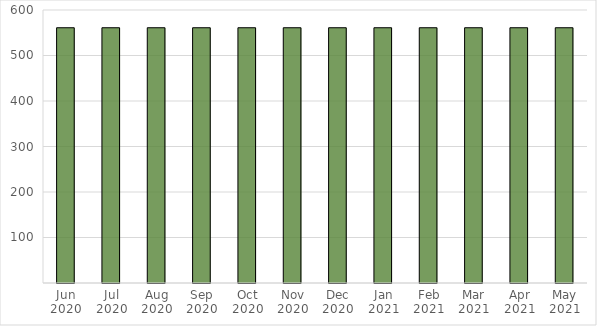
| Category | Total Other Income |
|---|---|
| Jun 2020 | 561 |
| Jul 2020 | 561 |
| Aug 2020 | 561 |
| Sep 2020 | 561 |
| Oct 2020 | 561 |
| Nov 2020 | 561 |
| Dec 2020 | 561 |
| Jan 2021 | 561 |
| Feb 2021 | 561 |
| Mar 2021 | 561 |
| Apr 2021 | 561 |
| May 2021 | 561 |